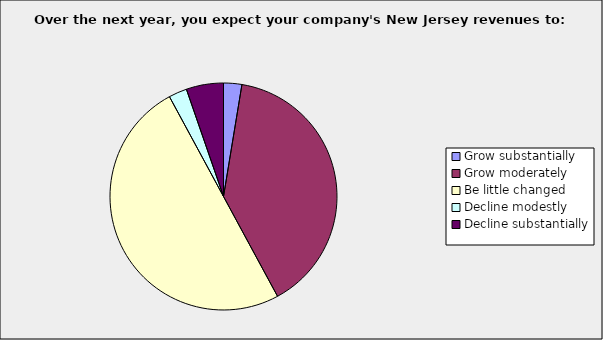
| Category | Series 0 |
|---|---|
| Grow substantially | 0.026 |
| Grow moderately | 0.395 |
| Be little changed | 0.5 |
| Decline modestly | 0.026 |
| Decline substantially | 0.053 |